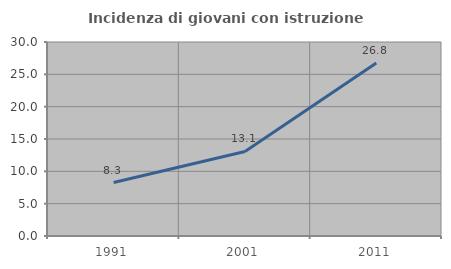
| Category | Incidenza di giovani con istruzione universitaria |
|---|---|
| 1991.0 | 8.264 |
| 2001.0 | 13.078 |
| 2011.0 | 26.762 |